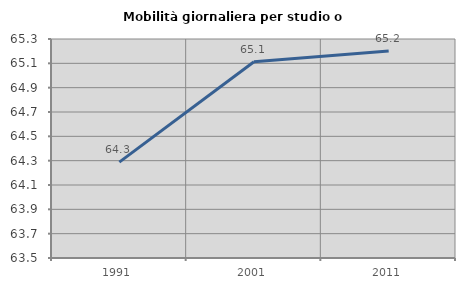
| Category | Mobilità giornaliera per studio o lavoro |
|---|---|
| 1991.0 | 64.288 |
| 2001.0 | 65.112 |
| 2011.0 | 65.201 |